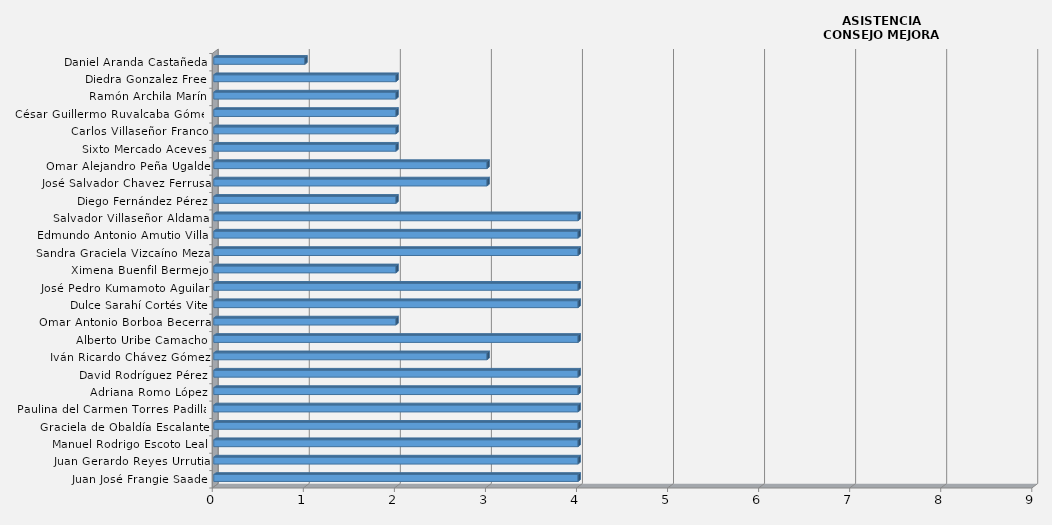
| Category | Series 0 |
|---|---|
| Juan José Frangie Saade | 4 |
| Juan Gerardo Reyes Urrutia | 4 |
| Manuel Rodrigo Escoto Leal | 4 |
| Graciela de Obaldía Escalante | 4 |
| Paulina del Carmen Torres Padilla  | 4 |
| Adriana Romo López | 4 |
| David Rodríguez Pérez | 4 |
| Iván Ricardo Chávez Gómez | 3 |
| Alberto Uribe Camacho | 4 |
| Omar Antonio Borboa Becerra | 2 |
| Dulce Sarahí Cortés Vite | 4 |
| José Pedro Kumamoto Aguilar | 4 |
| Ximena Buenfil Bermejo | 2 |
| Sandra Graciela Vizcaíno Meza | 4 |
| Edmundo Antonio Amutio Villa | 4 |
| Salvador Villaseñor Aldama | 4 |
| Diego Fernández Pérez | 2 |
| José Salvador Chavez Ferrusa | 3 |
| Omar Alejandro Peña Ugalde | 3 |
| Sixto Mercado Aceves | 2 |
| Carlos Villaseñor Franco | 2 |
| César Guillermo Ruvalcaba Gómez | 2 |
| Ramón Archila Marín | 2 |
| Diedra Gonzalez Free | 2 |
| Daniel Aranda Castañeda | 1 |